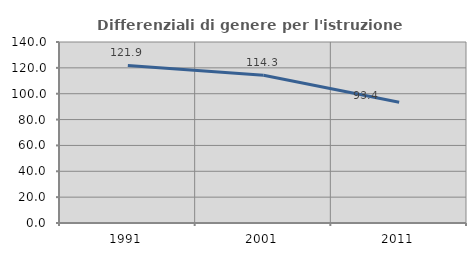
| Category | Differenziali di genere per l'istruzione superiore |
|---|---|
| 1991.0 | 121.869 |
| 2001.0 | 114.324 |
| 2011.0 | 93.449 |